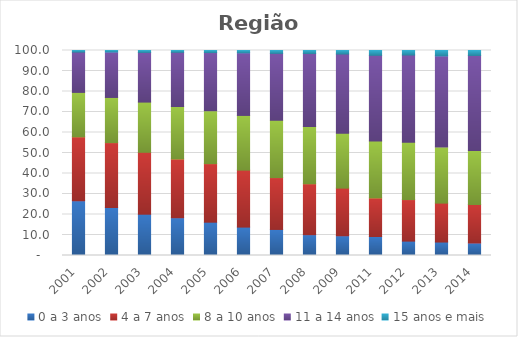
| Category | 0 a 3 anos | 4 a 7 anos | 8 a 10 anos | 11 a 14 anos | 15 anos e mais |
|---|---|---|---|---|---|
| 2001.0 | 26.65 | 31.24 | 21.68 | 19.64 | 0.79 |
| 2002.0 | 23.47 | 31.59 | 22.04 | 22.18 | 0.73 |
| 2003.0 | 20.14 | 30.2 | 24.49 | 24.22 | 0.95 |
| 2004.0 | 18.43 | 28.65 | 25.6 | 26.44 | 0.88 |
| 2005.0 | 16.25 | 28.56 | 25.8 | 28.39 | 1 |
| 2006.0 | 13.85 | 27.8 | 26.68 | 30.55 | 1.12 |
| 2007.0 | 12.71 | 25.3 | 27.93 | 32.65 | 1.41 |
| 2008.0 | 10.16 | 24.83 | 27.99 | 35.57 | 1.46 |
| 2009.0 | 9.63 | 23.24 | 26.71 | 38.7 | 1.72 |
| 2011.0 | 9.26 | 18.83 | 27.76 | 41.8 | 2.35 |
| 2012.0 | 7.01 | 20.27 | 27.96 | 42.56 | 2.19 |
| 2013.0 | 6.56 | 18.99 | 27.38 | 44.45 | 2.62 |
| 2014.0 | 6.1 | 18.79 | 26.38 | 46.31 | 2.43 |